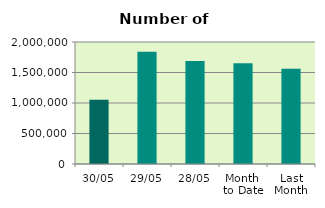
| Category | Series 0 |
|---|---|
| 30/05 | 1051698 |
| 29/05 | 1841750 |
| 28/05 | 1687306 |
| Month 
to Date | 1653430.857 |
| Last
Month | 1561575.6 |